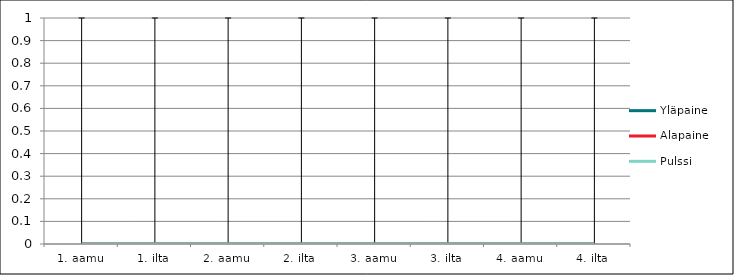
| Category | Yläpaine | Alapaine | Pulssi |
|---|---|---|---|
| 1. aamu | 0 | 0 | 0 |
| 1. ilta | 0 | 0 | 0 |
| 2. aamu | 0 | 0 | 0 |
| 2. ilta | 0 | 0 | 0 |
| 3. aamu | 0 | 0 | 0 |
| 3. ilta | 0 | 0 | 0 |
| 4. aamu | 0 | 0 | 0 |
| 4. ilta | 0 | 0 | 0 |